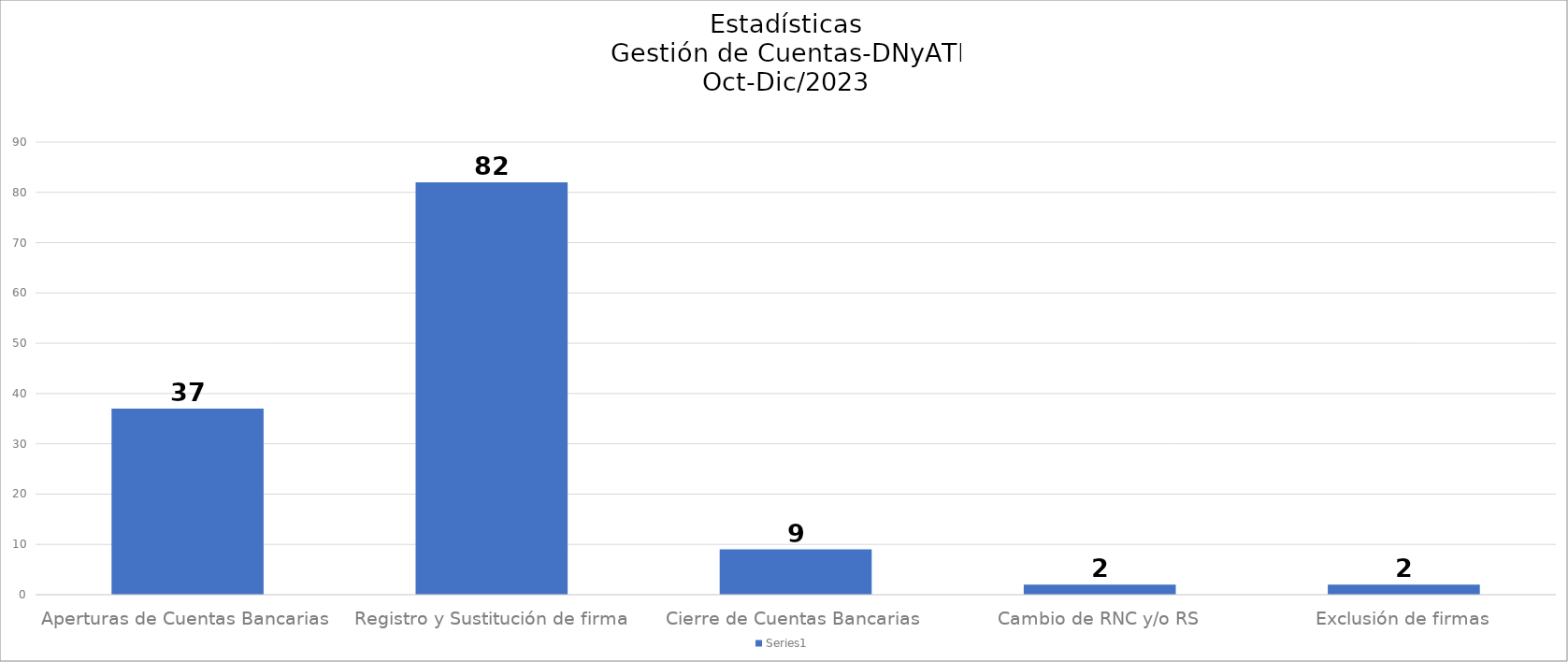
| Category | Series 0 |
|---|---|
| Aperturas de Cuentas Bancarias  | 37 |
| Registro y Sustitución de firma | 82 |
| Cierre de Cuentas Bancarias  | 9 |
| Cambio de RNC y/o RS | 2 |
| Exclusión de firmas | 2 |